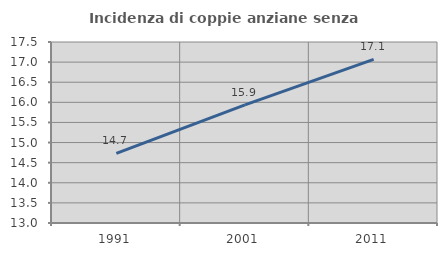
| Category | Incidenza di coppie anziane senza figli  |
|---|---|
| 1991.0 | 14.729 |
| 2001.0 | 15.938 |
| 2011.0 | 17.07 |